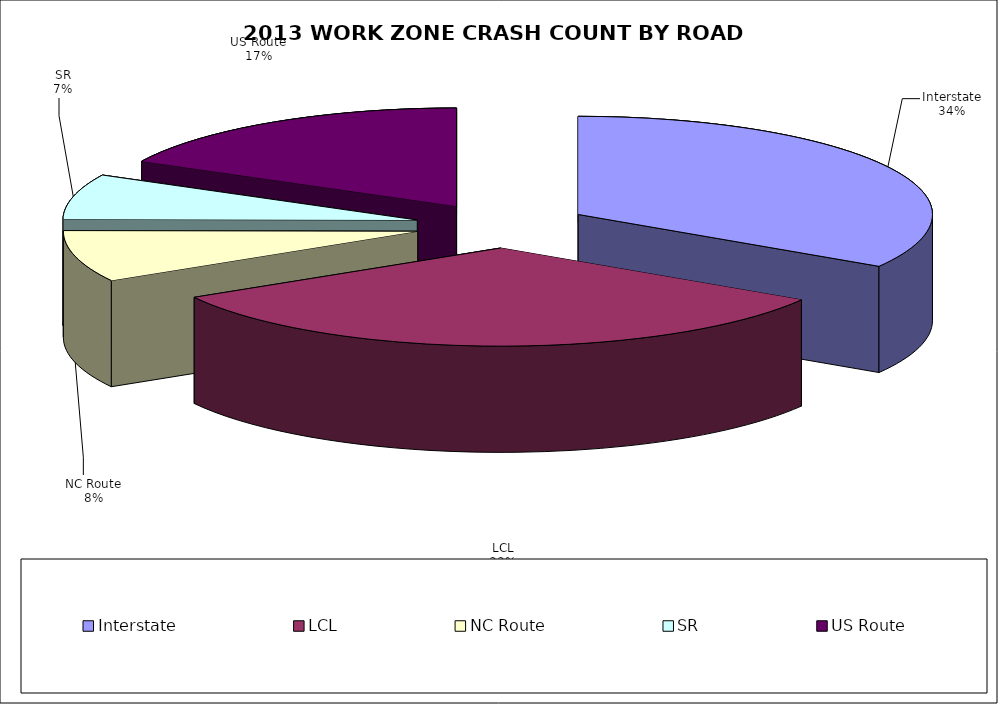
| Category | Series 0 | Series 1 |
|---|---|---|
| Interstate | 1178 | 0.339 |
| LCL | 1140 | 0.328 |
| NC Route | 295 | 0.085 |
| SR | 260 | 0.075 |
| US Route | 606 | 0.174 |